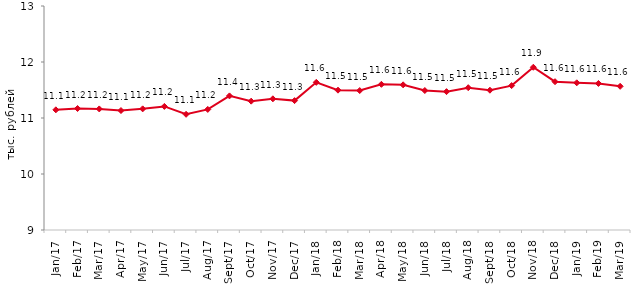
| Category | тыс. руб. |
|---|---|
| 2017-01-01 | 11.146 |
| 2017-02-01 | 11.17 |
| 2017-03-01 | 11.162 |
| 2017-04-01 | 11.133 |
| 2017-05-01 | 11.163 |
| 2017-06-01 | 11.207 |
| 2017-07-01 | 11.066 |
| 2017-08-01 | 11.153 |
| 2017-09-01 | 11.395 |
| 2017-10-01 | 11.301 |
| 2017-11-01 | 11.342 |
| 2017-12-01 | 11.31 |
| 2018-01-01 | 11.637 |
| 2018-02-01 | 11.497 |
| 2018-03-01 | 11.49 |
| 2018-04-01 | 11.601 |
| 2018-05-01 | 11.592 |
| 2018-06-01 | 11.491 |
| 2018-07-01 | 11.471 |
| 2018-08-01 | 11.541 |
| 2018-09-01 | 11.497 |
| 2018-10-01 | 11.578 |
| 2018-11-01 | 11.906 |
| 2018-12-01 | 11.648 |
| 2019-01-01 | 11.629 |
| 2019-02-01 | 11.617 |
| 2019-03-01 | 11.566 |